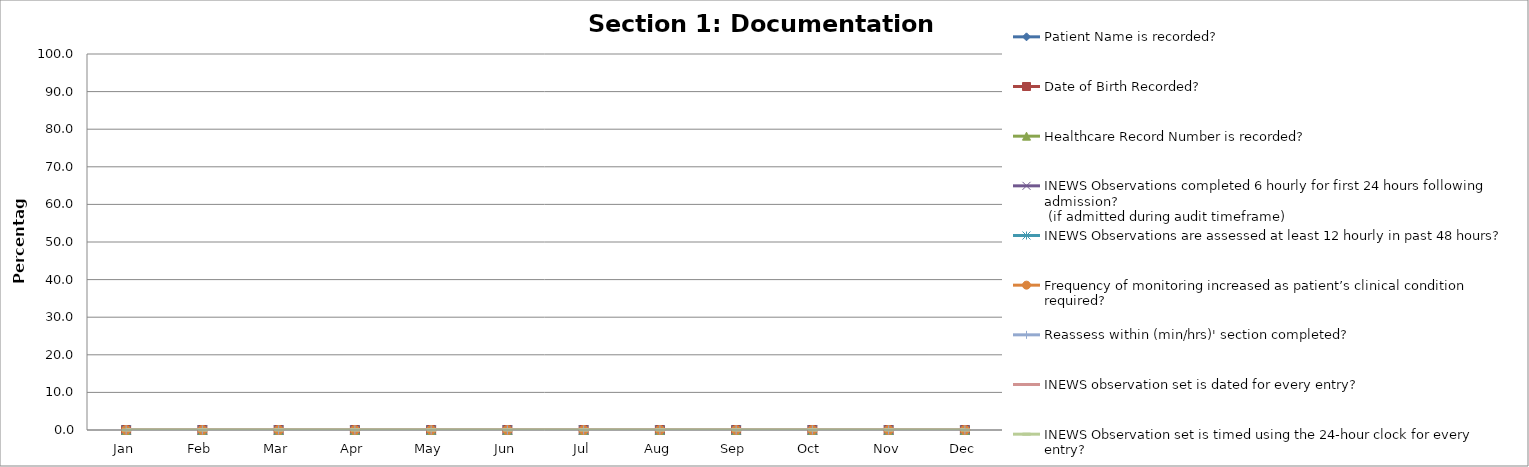
| Category | Patient Name is recorded? | Date of Birth Recorded? | Healthcare Record Number is recorded? | INEWS Observations completed 6 hourly for first 24 hours following admission?
 (if admitted during audit timeframe) | INEWS Observations are assessed at least 12 hourly in past 48 hours? | Frequency of monitoring increased as patient’s clinical condition required? | Reassess within (min/hrs)' section completed? | INEWS observation set is dated for every entry? | INEWS Observation set is timed using the 24-hour clock for every entry? |
|---|---|---|---|---|---|---|---|---|---|
| Jan | 0 | 0 | 0 | 0 | 0 | 0 | 0 | 0 | 0 |
| Feb | 0 | 0 | 0 | 0 | 0 | 0 | 0 | 0 | 0 |
| Mar | 0 | 0 | 0 | 0 | 0 | 0 | 0 | 0 | 0 |
| Apr | 0 | 0 | 0 | 0 | 0 | 0 | 0 | 0 | 0 |
| May | 0 | 0 | 0 | 0 | 0 | 0 | 0 | 0 | 0 |
| Jun | 0 | 0 | 0 | 0 | 0 | 0 | 0 | 0 | 0 |
| Jul | 0 | 0 | 0 | 0 | 0 | 0 | 0 | 0 | 0 |
| Aug | 0 | 0 | 0 | 0 | 0 | 0 | 0 | 0 | 0 |
| Sep | 0 | 0 | 0 | 0 | 0 | 0 | 0 | 0 | 0 |
| Oct | 0 | 0 | 0 | 0 | 0 | 0 | 0 | 0 | 0 |
| Nov | 0 | 0 | 0 | 0 | 0 | 0 | 0 | 0 | 0 |
| Dec | 0 | 0 | 0 | 0 | 0 | 0 | 0 | 0 | 0 |